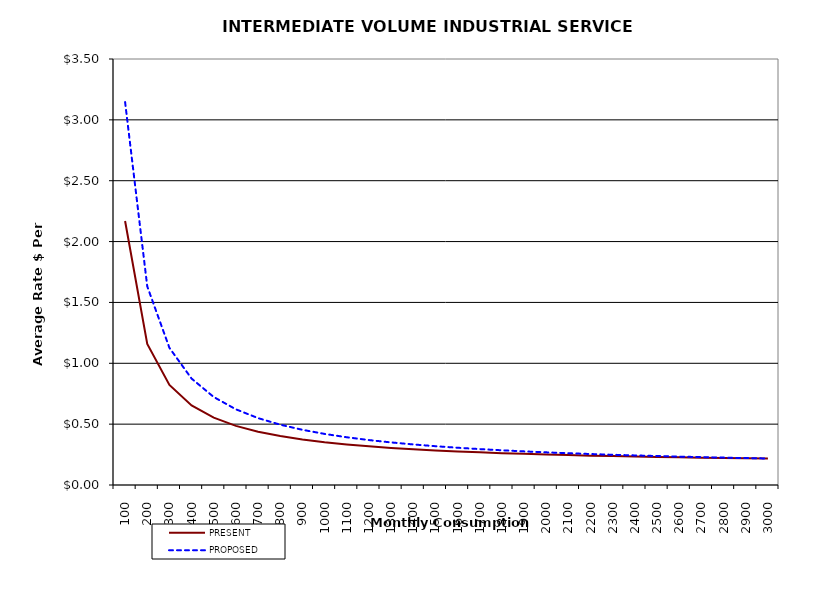
| Category | PRESENT | PROPOSED |
|---|---|---|
| 100.0 | 2.169 | 3.147 |
| 200.0 | 1.159 | 1.632 |
| 300.0 | 0.822 | 1.127 |
| 400.0 | 0.654 | 0.874 |
| 500.0 | 0.553 | 0.723 |
| 600.0 | 0.486 | 0.622 |
| 700.0 | 0.438 | 0.55 |
| 800.0 | 0.402 | 0.496 |
| 900.0 | 0.374 | 0.453 |
| 1000.0 | 0.351 | 0.42 |
| 1100.0 | 0.333 | 0.392 |
| 1200.0 | 0.318 | 0.369 |
| 1300.0 | 0.305 | 0.35 |
| 1400.0 | 0.294 | 0.333 |
| 1500.0 | 0.284 | 0.319 |
| 1600.0 | 0.276 | 0.306 |
| 1700.0 | 0.268 | 0.295 |
| 1800.0 | 0.262 | 0.285 |
| 1900.0 | 0.256 | 0.276 |
| 2000.0 | 0.25 | 0.268 |
| 2100.0 | 0.246 | 0.261 |
| 2200.0 | 0.241 | 0.254 |
| 2300.0 | 0.237 | 0.248 |
| 2400.0 | 0.234 | 0.243 |
| 2500.0 | 0.23 | 0.238 |
| 2600.0 | 0.227 | 0.233 |
| 2700.0 | 0.224 | 0.229 |
| 2800.0 | 0.222 | 0.225 |
| 2900.0 | 0.219 | 0.221 |
| 3000.0 | 0.217 | 0.218 |